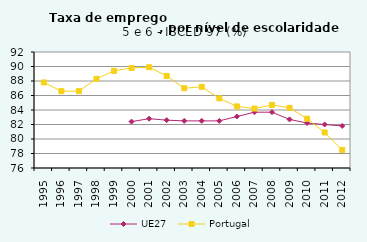
| Category | UE27 | Portugal |
|---|---|---|
| 1995.0 | 0 | 87.8 |
| 1996.0 | 0 | 86.6 |
| 1997.0 | 0 | 86.6 |
| 1998.0 | 0 | 88.3 |
| 1999.0 | 0 | 89.4 |
| 2000.0 | 82.4 | 89.8 |
| 2001.0 | 82.8 | 89.9 |
| 2002.0 | 82.6 | 88.7 |
| 2003.0 | 82.5 | 87 |
| 2004.0 | 82.5 | 87.2 |
| 2005.0 | 82.5 | 85.6 |
| 2006.0 | 83.1 | 84.5 |
| 2007.0 | 83.7 | 84.2 |
| 2008.0 | 83.7 | 84.7 |
| 2009.0 | 82.7 | 84.3 |
| 2010.0 | 82.2 | 82.8 |
| 2011.0 | 82 | 80.9 |
| 2012.0 | 81.8 | 78.5 |